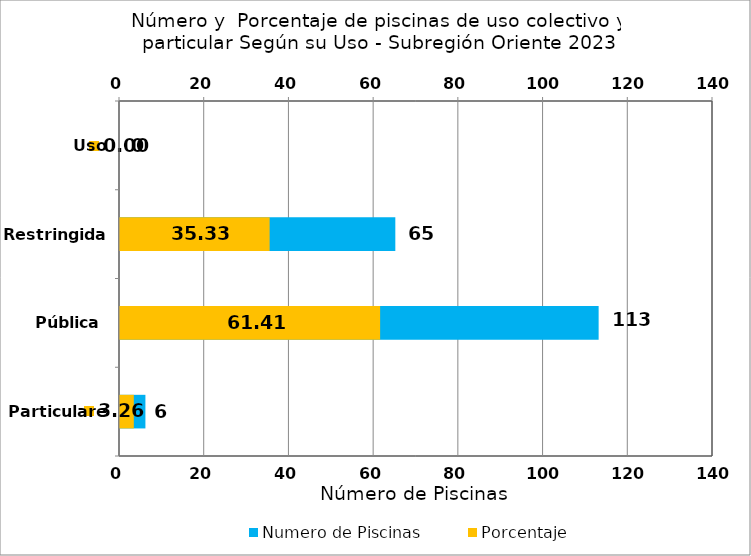
| Category | Numero de Piscinas |
|---|---|
| Particulares | 6 |
| Pública | 113 |
| Restringida | 65 |
| Uso Especial | 0 |